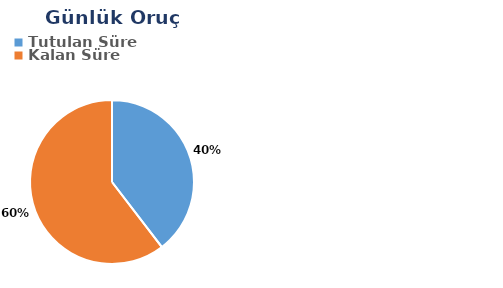
| Category | Günlük |
|---|---|
| Tutulan Süre | 0.23 |
| Kalan Süre | 0.352 |